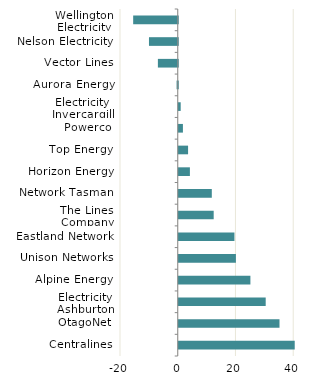
| Category | Series 0 |
|---|---|
| Wellington Electricity | -15.437 |
| Nelson Electricity | -9.967 |
| Vector Lines | -6.878 |
| Aurora Energy | -0.395 |
| Electricity Invercargill | 0.676 |
| Powerco | 1.446 |
| Top Energy | 3.233 |
| Horizon Energy | 3.865 |
| Network Tasman | 11.452 |
| The Lines Company | 12.105 |
| Eastland Network | 19.289 |
| Unison Networks | 19.799 |
| Alpine Energy | 24.822 |
| Electricity Ashburton | 30.12 |
| OtagoNet | 34.899 |
| Centralines | 40.174 |